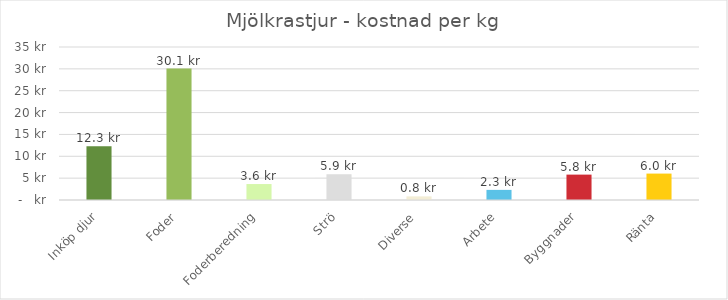
| Category | Series 0 |
|---|---|
| Inköp djur | 12.322 |
| Foder | 30.06 |
| Foderberedning | 3.648 |
| Strö | 5.893 |
| Diverse | 0.825 |
| Arbete | 2.315 |
| Byggnader | 5.808 |
| Ränta | 6.042 |